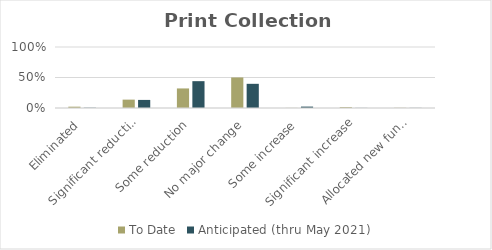
| Category | To Date | Anticipated (thru May 2021) |
|---|---|---|
| Eliminated | 0.022 | 0.004 |
| Significant reduction | 0.137 | 0.132 |
| Some reduction | 0.321 | 0.44 |
| No major change | 0.501 | 0.396 |
| Some increase | 0.002 | 0.023 |
| Significant increase | 0.015 | 0.002 |
| Allocated new funding | 0.004 | 0.002 |